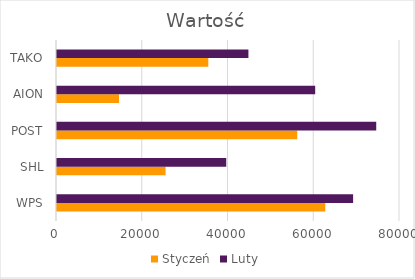
| Category | Styczeń | Luty |
|---|---|---|
| WPS | 62564 | 69065 |
| SHL | 25321 | 39475 |
| POST | 56032 | 74457 |
| AION | 14465 | 60220 |
| TAKO | 35288 | 44645 |